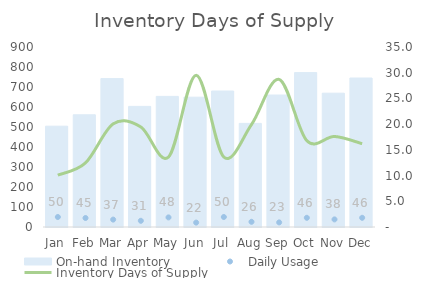
| Category | On-hand Inventory |
|---|---|
| Jan | 504 |
| Feb | 561 |
| Mar | 742 |
| Apr | 603 |
| May | 653 |
| Jun | 649 |
| Jul | 680 |
| Aug | 518 |
| Sep | 660 |
| Oct | 772 |
| Nov | 669 |
| Dec | 745 |